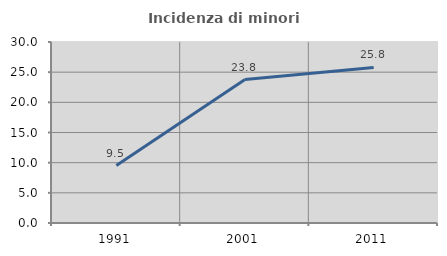
| Category | Incidenza di minori stranieri |
|---|---|
| 1991.0 | 9.524 |
| 2001.0 | 23.77 |
| 2011.0 | 25.777 |